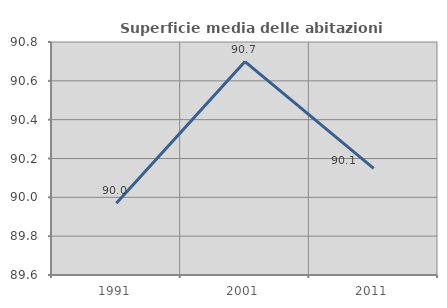
| Category | Superficie media delle abitazioni occupate |
|---|---|
| 1991.0 | 89.97 |
| 2001.0 | 90.699 |
| 2011.0 | 90.15 |